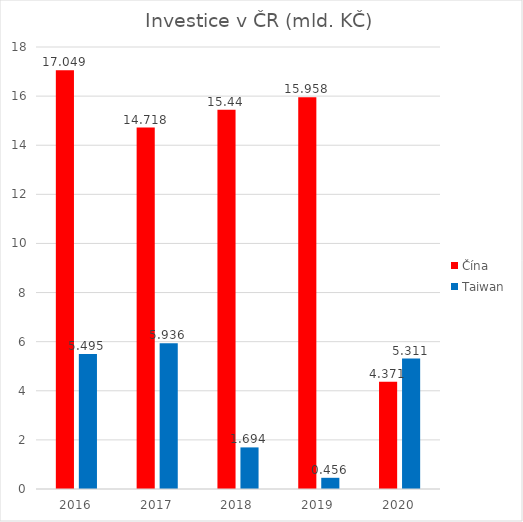
| Category | Čína | Taiwan |
|---|---|---|
| 2016.0 | 17.049 | 5.495 |
| 2017.0 | 14.718 | 5.936 |
| 2018.0 | 15.44 | 1.694 |
| 2019.0 | 15.958 | 0.456 |
| 2020.0 | 4.371 | 5.311 |